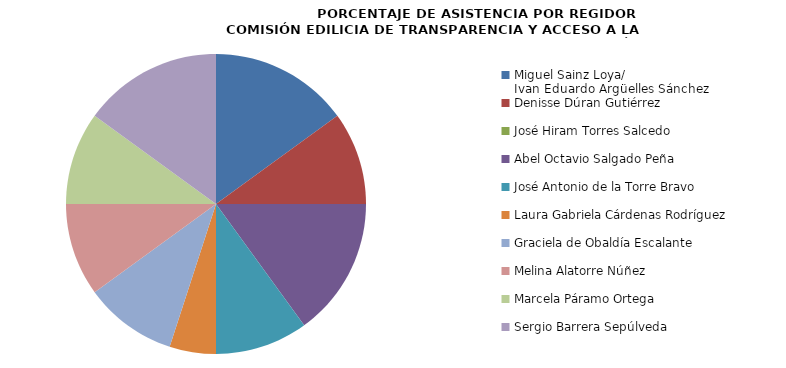
| Category | Series 0 |
|---|---|
| Miguel Sainz Loya/
Ivan Eduardo Argüelles Sánchez | 100 |
| Denisse Dúran Gutiérrez | 66.667 |
| José Hiram Torres Salcedo | 0 |
| Abel Octavio Salgado Peña | 100 |
| José Antonio de la Torre Bravo | 66.667 |
| Laura Gabriela Cárdenas Rodríguez | 33.333 |
| Graciela de Obaldía Escalante | 66.667 |
| Melina Alatorre Núñez | 66.667 |
| Marcela Páramo Ortega | 66.667 |
| Sergio Barrera Sepúlveda | 100 |